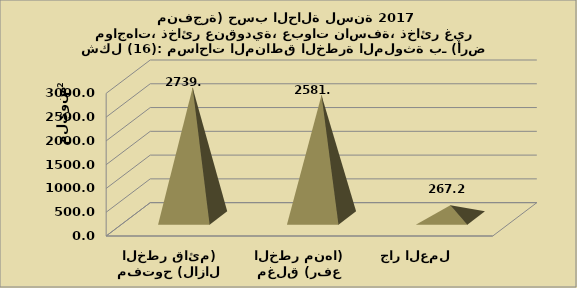
| Category | Series 0 |
|---|---|
| مفتوح (لازال الخطر قائم) | 2739.299 |
| مغلق (رفع الخطر منها) | 2581.364 |
|  جار العمل      | 267.174 |